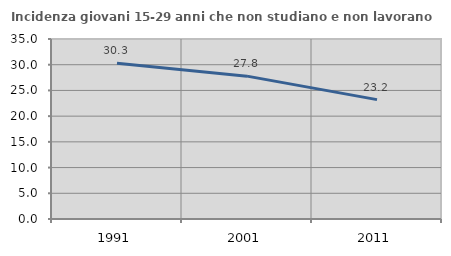
| Category | Incidenza giovani 15-29 anni che non studiano e non lavorano  |
|---|---|
| 1991.0 | 30.303 |
| 2001.0 | 27.778 |
| 2011.0 | 23.214 |